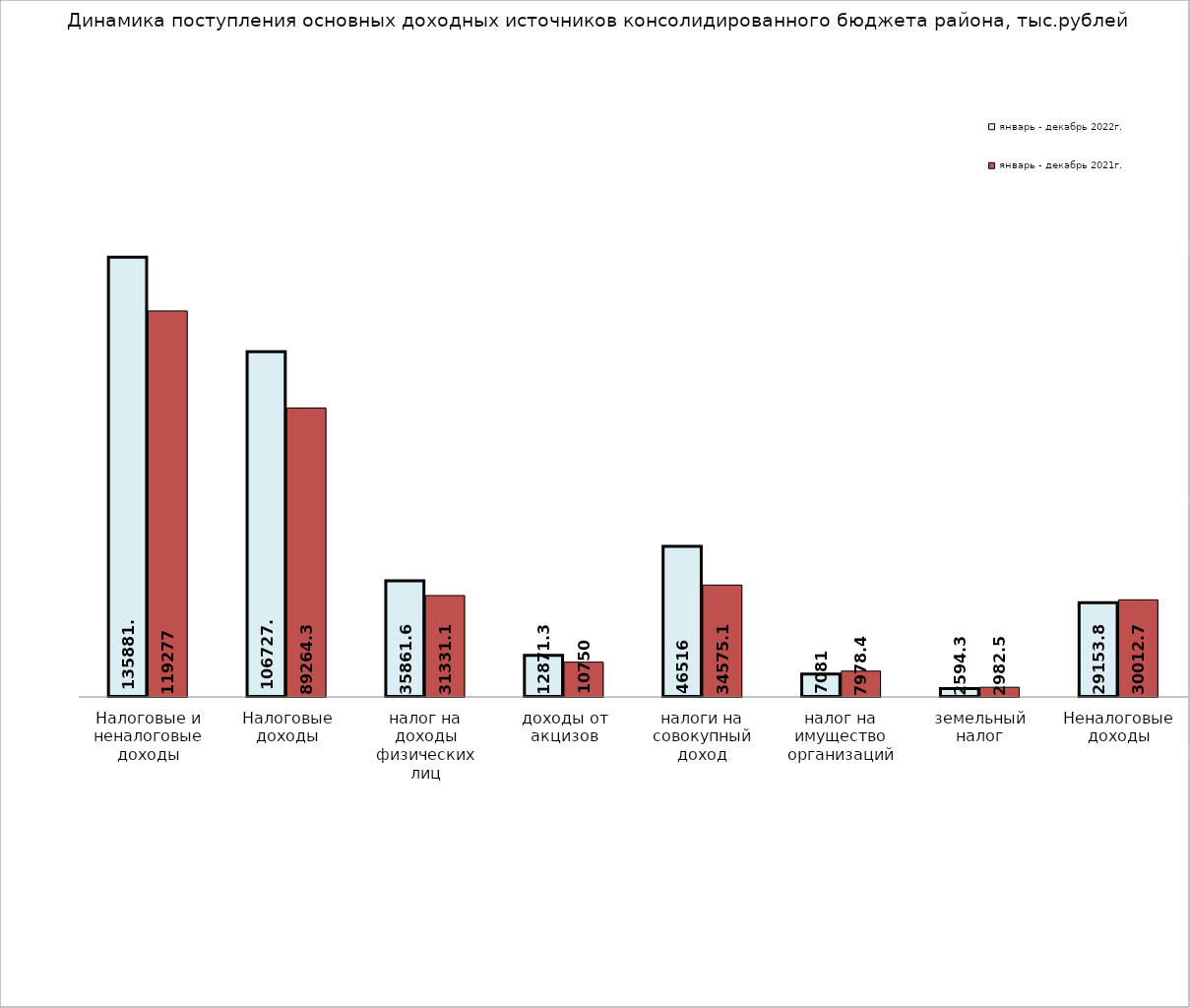
| Category | январь - декабрь 2022г. | январь - декабрь 2021г. |
|---|---|---|
| Налоговые и неналоговые доходы | 135881.6 | 119277 |
| Налоговые доходы | 106727.7 | 89264.3 |
| налог на доходы физических лиц | 35861.6 | 31331.1 |
| доходы от акцизов | 12871.3 | 10750 |
| налоги на совокупный доход | 46516 | 34575.1 |
| налог на имущество организаций | 7081 | 7978.4 |
| земельный налог | 2594.3 | 2982.5 |
| Неналоговые доходы | 29153.8 | 30012.7 |